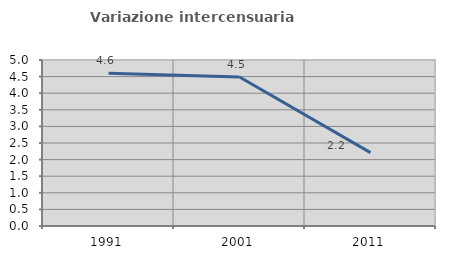
| Category | Variazione intercensuaria annua |
|---|---|
| 1991.0 | 4.602 |
| 2001.0 | 4.488 |
| 2011.0 | 2.211 |